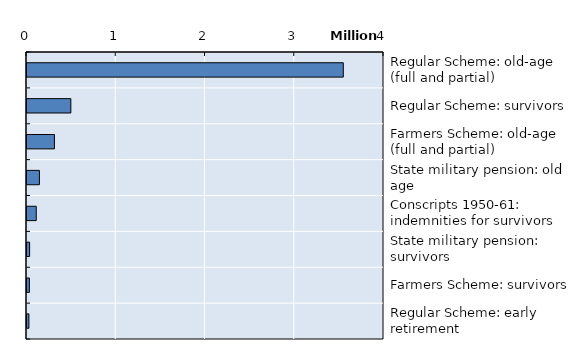
| Category | Series 0 |
|---|---|
| Regular Scheme: old-age (full and partial) | 3543885 |
| Regular Scheme: survivors | 491078 |
| Farmers Scheme: old-age (full and partial) | 307389 |
| State military pension: old age | 139099 |
| Conscripts 1950-61: indemnities for survivors | 103617.25 |
| State military pension: survivors | 29410 |
| Farmers Scheme: survivors | 26685 |
| Regular Scheme: early retirement | 21268 |